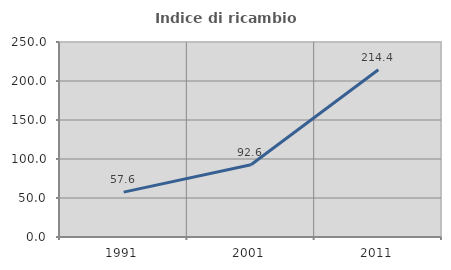
| Category | Indice di ricambio occupazionale  |
|---|---|
| 1991.0 | 57.562 |
| 2001.0 | 92.571 |
| 2011.0 | 214.409 |